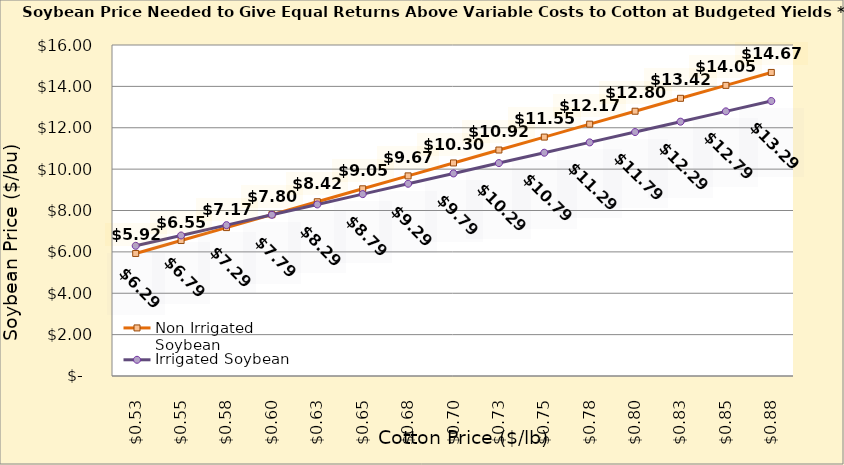
| Category | Non Irrigated Soybean | Irrigated Soybean |
|---|---|---|
| 0.5249999999999998 | 5.923 | 6.292 |
| 0.5499999999999998 | 6.548 | 6.792 |
| 0.5749999999999998 | 7.173 | 7.292 |
| 0.5999999999999999 | 7.798 | 7.792 |
| 0.6249999999999999 | 8.423 | 8.292 |
| 0.6499999999999999 | 9.048 | 8.792 |
| 0.6749999999999999 | 9.673 | 9.292 |
| 0.7 | 10.298 | 9.792 |
| 0.725 | 10.923 | 10.292 |
| 0.75 | 11.548 | 10.792 |
| 0.775 | 12.173 | 11.292 |
| 0.8 | 12.798 | 11.792 |
| 0.8250000000000001 | 13.423 | 12.292 |
| 0.8500000000000001 | 14.048 | 12.792 |
| 0.8750000000000001 | 14.673 | 13.292 |